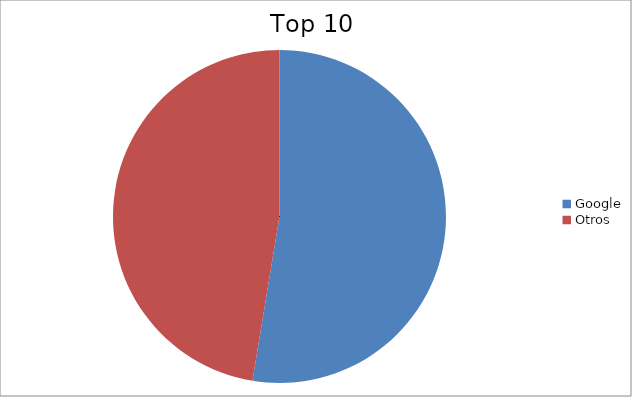
| Category | Series 0 |
|---|---|
| Google | 52.6 |
| Otros | 47.4 |